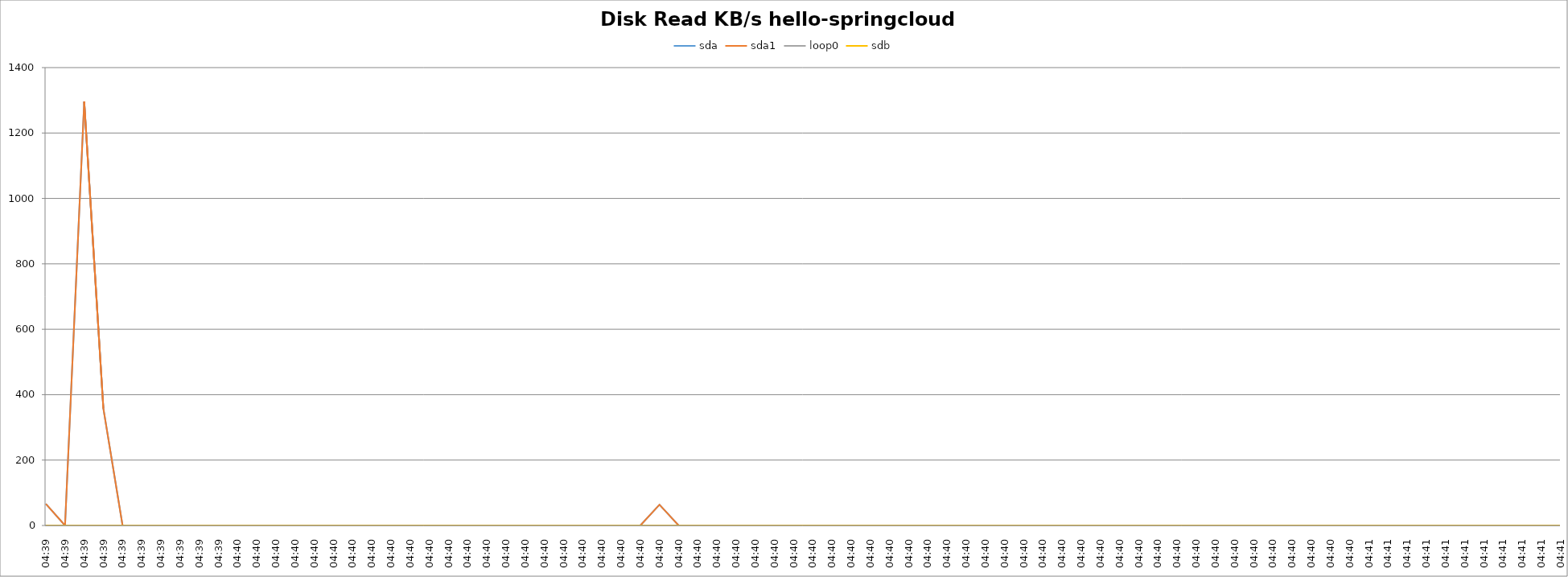
| Category | sda | sda1 | loop0 | sdb |
|---|---|---|---|---|
| 04:39 | 66.1 | 66.1 | 0 | 0 |
| 04:39 | 0 | 0 | 0 | 0 |
| 04:39 | 1296.2 | 1296.2 | 0 | 0 |
| 04:39 | 357.6 | 357.6 | 0 | 0 |
| 04:39 | 0 | 0 | 0 | 0 |
| 04:39 | 0 | 0 | 0 | 0 |
| 04:39 | 0 | 0 | 0 | 0 |
| 04:39 | 0 | 0 | 0 | 0 |
| 04:39 | 0 | 0 | 0 | 0 |
| 04:39 | 0 | 0 | 0 | 0 |
| 04:40 | 0 | 0 | 0 | 0 |
| 04:40 | 0 | 0 | 0 | 0 |
| 04:40 | 0 | 0 | 0 | 0 |
| 04:40 | 0 | 0 | 0 | 0 |
| 04:40 | 0 | 0 | 0 | 0 |
| 04:40 | 0 | 0 | 0 | 0 |
| 04:40 | 0 | 0 | 0 | 0 |
| 04:40 | 0 | 0 | 0 | 0 |
| 04:40 | 0 | 0 | 0 | 0 |
| 04:40 | 0 | 0 | 0 | 0 |
| 04:40 | 0 | 0 | 0 | 0 |
| 04:40 | 0 | 0 | 0 | 0 |
| 04:40 | 0 | 0 | 0 | 0 |
| 04:40 | 0 | 0 | 0 | 0 |
| 04:40 | 0 | 0 | 0 | 0 |
| 04:40 | 0 | 0 | 0 | 0 |
| 04:40 | 0 | 0 | 0 | 0 |
| 04:40 | 0 | 0 | 0 | 0 |
| 04:40 | 0 | 0 | 0 | 0 |
| 04:40 | 0 | 0 | 0 | 0 |
| 04:40 | 0 | 0 | 0 | 0 |
| 04:40 | 0 | 0 | 0 | 0 |
| 04:40 | 63.5 | 63.5 | 0 | 0 |
| 04:40 | 0 | 0 | 0 | 0 |
| 04:40 | 0 | 0 | 0 | 0 |
| 04:40 | 0 | 0 | 0 | 0 |
| 04:40 | 0 | 0 | 0 | 0 |
| 04:40 | 0 | 0 | 0 | 0 |
| 04:40 | 0 | 0 | 0 | 0 |
| 04:40 | 0 | 0 | 0 | 0 |
| 04:40 | 0 | 0 | 0 | 0 |
| 04:40 | 0 | 0 | 0 | 0 |
| 04:40 | 0 | 0 | 0 | 0 |
| 04:40 | 0 | 0 | 0 | 0 |
| 04:40 | 0 | 0 | 0 | 0 |
| 04:40 | 0 | 0 | 0 | 0 |
| 04:40 | 0 | 0 | 0 | 0 |
| 04:40 | 0 | 0 | 0 | 0 |
| 04:40 | 0 | 0 | 0 | 0 |
| 04:40 | 0 | 0 | 0 | 0 |
| 04:40 | 0 | 0 | 0 | 0 |
| 04:40 | 0 | 0 | 0 | 0 |
| 04:40 | 0 | 0 | 0 | 0 |
| 04:40 | 0 | 0 | 0 | 0 |
| 04:40 | 0 | 0 | 0 | 0 |
| 04:40 | 0 | 0 | 0 | 0 |
| 04:40 | 0 | 0 | 0 | 0 |
| 04:40 | 0 | 0 | 0 | 0 |
| 04:40 | 0 | 0 | 0 | 0 |
| 04:40 | 0 | 0 | 0 | 0 |
| 04:40 | 0 | 0 | 0 | 0 |
| 04:40 | 0 | 0 | 0 | 0 |
| 04:40 | 0 | 0 | 0 | 0 |
| 04:40 | 0 | 0 | 0 | 0 |
| 04:40 | 0 | 0 | 0 | 0 |
| 04:40 | 0 | 0 | 0 | 0 |
| 04:40 | 0 | 0 | 0 | 0 |
| 04:40 | 0 | 0 | 0 | 0 |
| 04:40 | 0 | 0 | 0 | 0 |
| 04:41 | 0 | 0 | 0 | 0 |
| 04:41 | 0 | 0 | 0 | 0 |
| 04:41 | 0 | 0 | 0 | 0 |
| 04:41 | 0 | 0 | 0 | 0 |
| 04:41 | 0 | 0 | 0 | 0 |
| 04:41 | 0 | 0 | 0 | 0 |
| 04:41 | 0 | 0 | 0 | 0 |
| 04:41 | 0 | 0 | 0 | 0 |
| 04:41 | 0 | 0 | 0 | 0 |
| 04:41 | 0 | 0 | 0 | 0 |
| 04:41 | 0 | 0 | 0 | 0 |